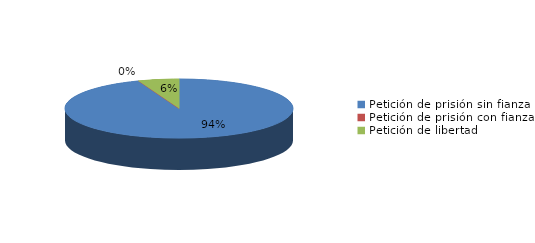
| Category | Series 0 |
|---|---|
| Petición de prisión sin fianza | 163 |
| Petición de prisión con fianza | 0 |
| Petición de libertad | 10 |